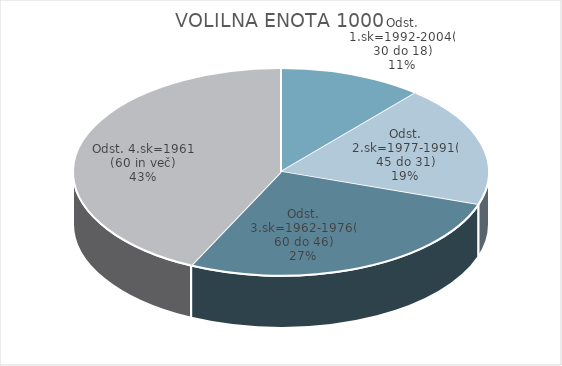
| Category | VOLILNA ENOTA 1000 |
|---|---|
| Odst. 1.sk=1992-2004(30 do 18) | 4.99 |
| Odst. 2.sk=1977-1991(45 do 31) | 8.4 |
| Odst. 3.sk=1962-1976(60 do 46) | 11.97 |
| Odst. 4.sk=1961 (60 in več) | 19.05 |